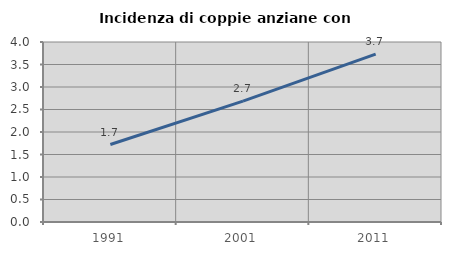
| Category | Incidenza di coppie anziane con figli |
|---|---|
| 1991.0 | 1.721 |
| 2001.0 | 2.688 |
| 2011.0 | 3.731 |